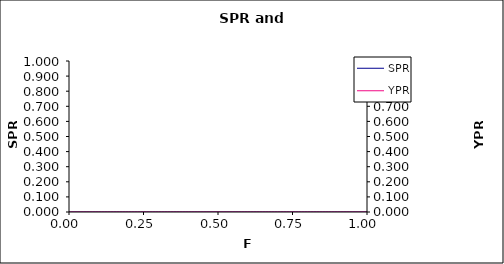
| Category | SPR |
|---|---|
| 0.0 | 0 |
| 0.01 | 0 |
| 0.02 | 0 |
| 0.03 | 0 |
| 0.04 | 0 |
| 0.05 | 0 |
| 0.06 | 0 |
| 0.07 | 0 |
| 0.08 | 0 |
| 0.09 | 0 |
| 0.1 | 0 |
| 0.11 | 0 |
| 0.12 | 0 |
| 0.13 | 0 |
| 0.14 | 0 |
| 0.15 | 0 |
| 0.16 | 0 |
| 0.17 | 0 |
| 0.18 | 0 |
| 0.19 | 0 |
| 0.2 | 0 |
| 0.21 | 0 |
| 0.22 | 0 |
| 0.23 | 0 |
| 0.24 | 0 |
| 0.25 | 0 |
| 0.26 | 0 |
| 0.27 | 0 |
| 0.28 | 0 |
| 0.29 | 0 |
| 0.3 | 0 |
| 0.31 | 0 |
| 0.32 | 0 |
| 0.33 | 0 |
| 0.34 | 0 |
| 0.35 | 0 |
| 0.36 | 0 |
| 0.37 | 0 |
| 0.38 | 0 |
| 0.39 | 0 |
| 0.4 | 0 |
| 0.41 | 0 |
| 0.42 | 0 |
| 0.43 | 0 |
| 0.44 | 0 |
| 0.45 | 0 |
| 0.46 | 0 |
| 0.47 | 0 |
| 0.48 | 0 |
| 0.49 | 0 |
| 0.5 | 0 |
| 0.51 | 0 |
| 0.52 | 0 |
| 0.53 | 0 |
| 0.54 | 0 |
| 0.55 | 0 |
| 0.56 | 0 |
| 0.57 | 0 |
| 0.58 | 0 |
| 0.59 | 0 |
| 0.6 | 0 |
| 0.61 | 0 |
| 0.62 | 0 |
| 0.63 | 0 |
| 0.64 | 0 |
| 0.65 | 0 |
| 0.66 | 0 |
| 0.67 | 0 |
| 0.68 | 0 |
| 0.69 | 0 |
| 0.7 | 0 |
| 0.71 | 0 |
| 0.72 | 0 |
| 0.73 | 0 |
| 0.74 | 0 |
| 0.75 | 0 |
| 0.76 | 0 |
| 0.77 | 0 |
| 0.78 | 0 |
| 0.79 | 0 |
| 0.8 | 0 |
| 0.81 | 0 |
| 0.82 | 0 |
| 0.83 | 0 |
| 0.84 | 0 |
| 0.85 | 0 |
| 0.86 | 0 |
| 0.87 | 0 |
| 0.88 | 0 |
| 0.89 | 0 |
| 0.9 | 0 |
| 0.91 | 0 |
| 0.92 | 0 |
| 0.93 | 0 |
| 0.94 | 0 |
| 0.95 | 0 |
| 0.96 | 0 |
| 0.97 | 0 |
| 0.98 | 0 |
| 0.99 | 0 |
| 1.0 | 0 |
| 1.01 | 0 |
| 1.02 | 0 |
| 1.03 | 0 |
| 1.04 | 0 |
| 1.05 | 0 |
| 1.06 | 0 |
| 1.07 | 0 |
| 1.08 | 0 |
| 1.09 | 0 |
| 1.1 | 0 |
| 1.11 | 0 |
| 1.12 | 0 |
| 1.13 | 0 |
| 1.14 | 0 |
| 1.15 | 0 |
| 1.16 | 0 |
| 1.17 | 0 |
| 1.18 | 0 |
| 1.19 | 0 |
| 1.2 | 0 |
| 1.21 | 0 |
| 1.22 | 0 |
| 1.23 | 0 |
| 1.24 | 0 |
| 1.25 | 0 |
| 1.26 | 0 |
| 1.27 | 0 |
| 1.28 | 0 |
| 1.29 | 0 |
| 1.3 | 0 |
| 1.31 | 0 |
| 1.32 | 0 |
| 1.33 | 0 |
| 1.34 | 0 |
| 1.35 | 0 |
| 1.36 | 0 |
| 1.37 | 0 |
| 1.38 | 0 |
| 1.39 | 0 |
| 1.4 | 0 |
| 1.41 | 0 |
| 1.42 | 0 |
| 1.43 | 0 |
| 1.44 | 0 |
| 1.45 | 0 |
| 1.46 | 0 |
| 1.47 | 0 |
| 1.48 | 0 |
| 1.49 | 0 |
| 1.5 | 0 |